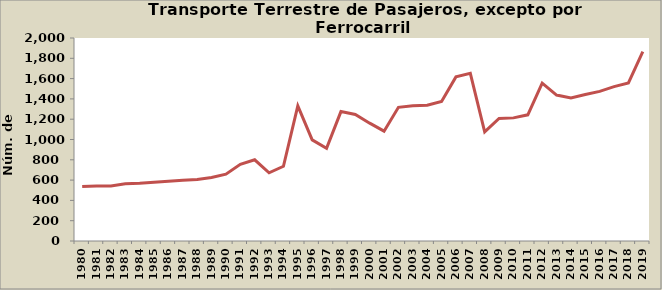
| Category | Series 0 |
|---|---|
| 1980.0 | 537 |
| 1981.0 | 543 |
| 1982.0 | 541 |
| 1983.0 | 563 |
| 1984.0 | 568 |
| 1985.0 | 579 |
| 1986.0 | 589 |
| 1987.0 | 599 |
| 1988.0 | 607 |
| 1989.0 | 625 |
| 1990.0 | 658 |
| 1991.0 | 755 |
| 1992.0 | 800 |
| 1993.0 | 672 |
| 1994.0 | 736 |
| 1995.0 | 1331 |
| 1996.0 | 996 |
| 1997.0 | 914 |
| 1998.0 | 1275 |
| 1999.0 | 1247 |
| 2000.0 | 1161 |
| 2001.0 | 1082 |
| 2002.0 | 1317 |
| 2003.0 | 1333 |
| 2004.0 | 1337 |
| 2005.0 | 1375 |
| 2006.0 | 1617 |
| 2007.0 | 1652 |
| 2008.0 | 1075 |
| 2009.0 | 1207 |
| 2010.0 | 1213 |
| 2011.0 | 1243 |
| 2012.0 | 1556 |
| 2013.0 | 1438 |
| 2014.0 | 1409 |
| 2015.0 | 1443 |
| 2016.0 | 1474 |
| 2017.0 | 1521 |
| 2018.0 | 1557 |
| 2019.0 | 1866 |